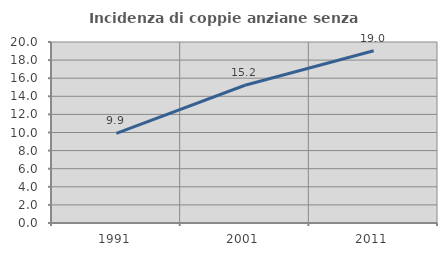
| Category | Incidenza di coppie anziane senza figli  |
|---|---|
| 1991.0 | 9.896 |
| 2001.0 | 15.22 |
| 2011.0 | 19.034 |